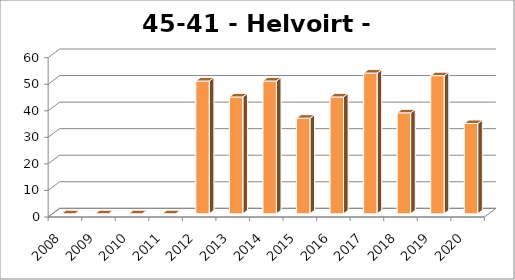
| Category | Helvoirt - Cromvoirt |
|---|---|
| 2008.0 | 0 |
| 2009.0 | 0 |
| 2010.0 | 0 |
| 2011.0 | 0 |
| 2012.0 | 50 |
| 2013.0 | 44 |
| 2014.0 | 50 |
| 2015.0 | 36 |
| 2016.0 | 44 |
| 2017.0 | 53 |
| 2018.0 | 38 |
| 2019.0 | 52 |
| 2020.0 | 34 |